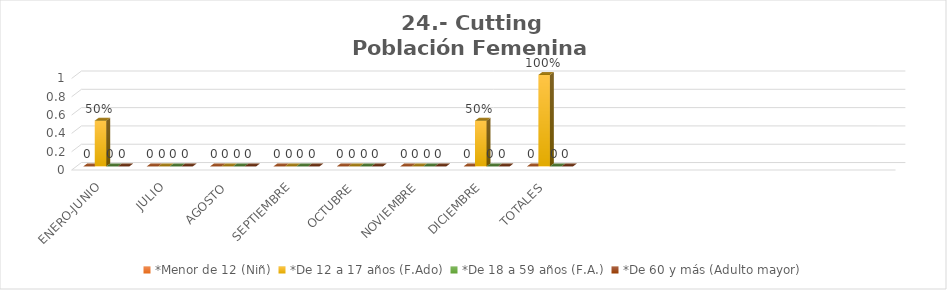
| Category | *Menor de 12 (Niñ) | *De 12 a 17 años (F.Ado) | *De 18 a 59 años (F.A.) | *De 60 y más (Adulto mayor) |
|---|---|---|---|---|
| ENERO-JUNIO | 0 | 0.5 | 0 | 0 |
| JULIO | 0 | 0 | 0 | 0 |
| AGOSTO | 0 | 0 | 0 | 0 |
| SEPTIEMBRE | 0 | 0 | 0 | 0 |
| OCTUBRE | 0 | 0 | 0 | 0 |
| NOVIEMBRE | 0 | 0 | 0 | 0 |
| DICIEMBRE | 0 | 0.5 | 0 | 0 |
| TOTALES | 0 | 1 | 0 | 0 |